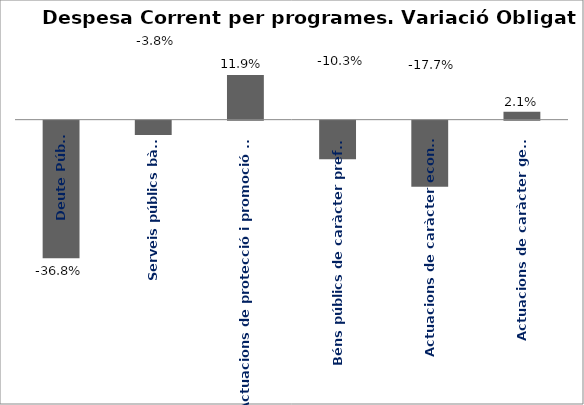
| Category | Series 0 |
|---|---|
| Deute Públic | -0.368 |
| Serveis públics bàsics | -0.038 |
| Actuacions de protecció i promoció social | 0.119 |
| Béns públics de caràcter preferent | -0.103 |
| Actuacions de caràcter econòmic | -0.177 |
| Actuacions de caràcter general | 0.021 |